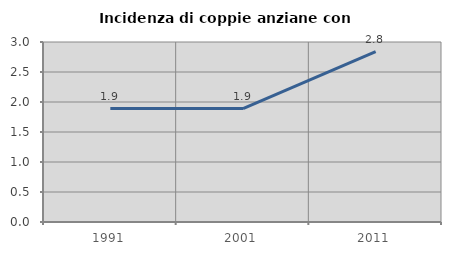
| Category | Incidenza di coppie anziane con figli |
|---|---|
| 1991.0 | 1.891 |
| 2001.0 | 1.891 |
| 2011.0 | 2.841 |